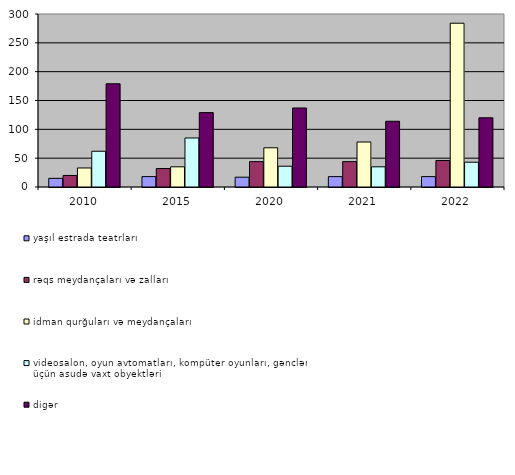
| Category | yaşıl estrada teatrları | rəqs meydançaları və zalları | idman qurğuları və meydançaları | videosalon, oyun avtomatları, kompüter oyunları, gənclər üçün asudə vaxt obyektləri | digər  |
|---|---|---|---|---|---|
| 2010.0 | 15 | 20 | 33 | 62 | 179 |
| 2015.0 | 18 | 32 | 35 | 85 | 129 |
| 2020.0 | 17 | 44 | 68 | 36 | 137 |
| 2021.0 | 18 | 44 | 78 | 35 | 114 |
| 2022.0 | 18 | 46 | 284 | 43 | 120 |